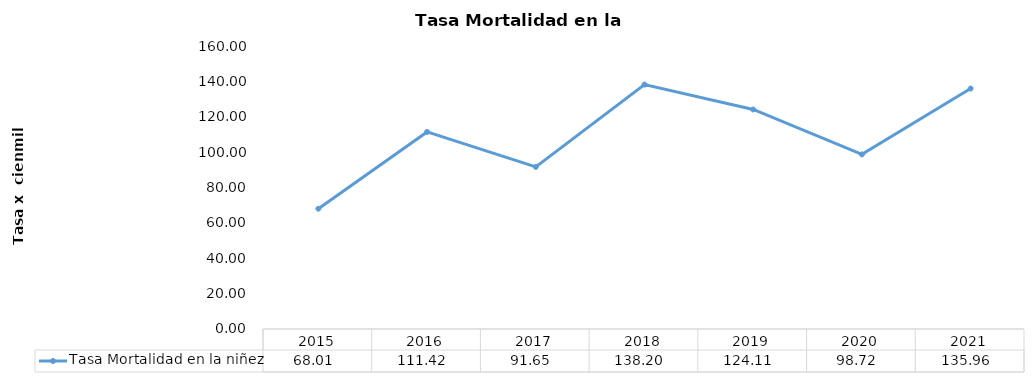
| Category | Tasa Mortalidad en la niñez |
|---|---|
| 0 | 68.011 |
| 1 | 111.418 |
| 2 | 91.646 |
| 3 | 138.2 |
| 4 | 124.108 |
| 5 | 98.723 |
| 6 | 135.962 |